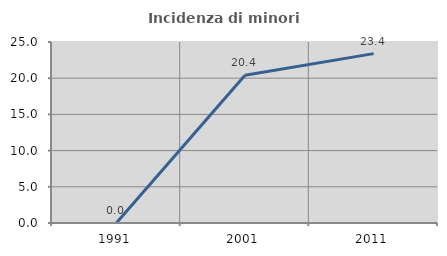
| Category | Incidenza di minori stranieri |
|---|---|
| 1991.0 | 0 |
| 2001.0 | 20.408 |
| 2011.0 | 23.392 |